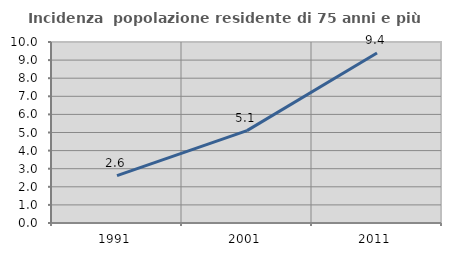
| Category | Incidenza  popolazione residente di 75 anni e più |
|---|---|
| 1991.0 | 2.622 |
| 2001.0 | 5.105 |
| 2011.0 | 9.391 |